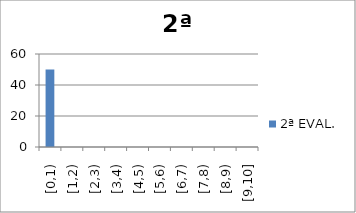
| Category | 2ª EVAL. |
|---|---|
| [0,1) | 50 |
| [1,2) | 0 |
| [2,3) | 0 |
| [3,4) | 0 |
| [4,5) | 0 |
| [5,6) | 0 |
| [6,7) | 0 |
| [7,8) | 0 |
| [8,9) | 0 |
| [9,10] | 0 |